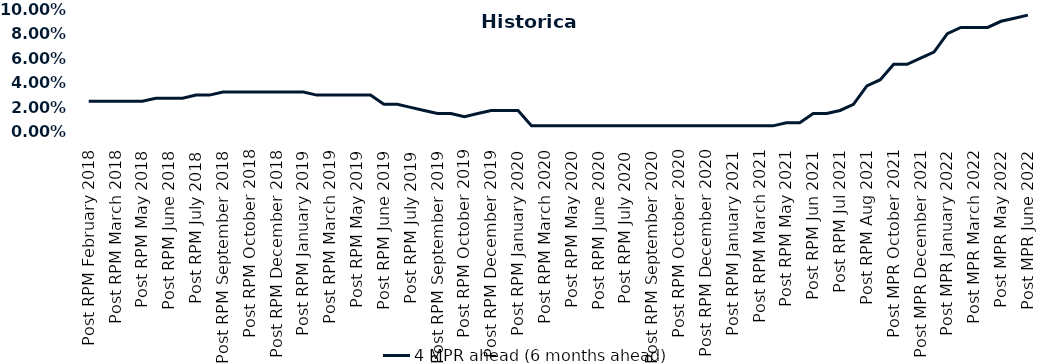
| Category | 4 MPR ahead (6 months ahead) |
|---|---|
| Post RPM February 2018 | 0.025 |
| Pre RPM March 2018 | 0.025 |
| Post RPM March 2018 | 0.025 |
| Pre RPM May 2018 | 0.025 |
| Post RPM May 2018 | 0.025 |
| Pre RPM June 2018 | 0.028 |
| Post RPM June 2018 | 0.028 |
| Pre RPM July 2018 | 0.028 |
| Post RPM July 2018 | 0.03 |
| Pre RPM September 2018 | 0.03 |
| Post RPM September 2018 | 0.032 |
| Pre RPM October 2018 | 0.032 |
| Post RPM October 2018 | 0.032 |
| Pre RPM December 2018 | 0.032 |
| Post RPM December 2018 | 0.032 |
| Pre RPM January 2019 | 0.032 |
| Post RPM January 2019 | 0.032 |
| Pre RPM March 2019 | 0.03 |
| Post RPM March 2019 | 0.03 |
| Pre RPM May 2019 | 0.03 |
| Post RPM May 2019 | 0.03 |
| Pre RPM June 2019 | 0.03 |
| Post RPM June 2019 | 0.022 |
| Pre RPM July 2019 | 0.022 |
| Post RPM July 2019 | 0.02 |
| Pre RPM September 2019 | 0.018 |
| Post RPM September 2019 | 0.015 |
| Pre RPM October 2019 | 0.015 |
| Post RPM October 2019 | 0.012 |
| Pre RPM December 2019 | 0.015 |
| Post RPM December 2019 | 0.018 |
| Pre RPM January 2020 | 0.018 |
| Post RPM January 2020 | 0.018 |
| Pre RPM March 2020 | 0.005 |
| Post RPM March 2020 | 0.005 |
| Pre RPM May 2020 | 0.005 |
| Post RPM May 2020 | 0.005 |
| Pre RPM June 2020 | 0.005 |
| Post RPM June 2020 | 0.005 |
| Pre RPM July 2020 | 0.005 |
| Post RPM July 2020 | 0.005 |
| Pre RPM September 2020 | 0.005 |
| Post RPM September 2020 | 0.005 |
| Pre RPM October 2020 | 0.005 |
| Post RPM October 2020 | 0.005 |
| Pre RPM December 2020 | 0.005 |
|  Post RPM December 2020 | 0.005 |
| Pre RPM January 2021 | 0.005 |
| Post RPM January 2021 | 0.005 |
|  Pre RPM March 2021 | 0.005 |
|  Post RPM March 2021 | 0.005 |
|  Pre RPM May 2021 | 0.005 |
|  Post RPM May 2021 | 0.008 |
|  Pre RPM Jun 2021 | 0.008 |
|   Post RPM Jun 2021 | 0.015 |
| Pre RPM Jul 2021 | 0.015 |
|  Post RPM Jul 2021 | 0.018 |
| Pre RPM Aug 2021 | 0.022 |
|  Post RPM Aug 2021 | 0.038 |
| Pre MPR October 2021 | 0.042 |
| Post MPR October 2021 | 0.055 |
| Pre MPR December 2021 | 0.055 |
| Post MPR December 2021 | 0.06 |
| Pre MPR January 2022 | 0.065 |
| Post MPR January 2022 | 0.08 |
| Pre MPR March 2022 | 0.085 |
| Post MPR March 2022 | 0.085 |
| Pre MPR May 2022 | 0.085 |
| Post MPR May 2022 | 0.09 |
| Pre MPR June 2022 | 0.092 |
| Post MPR June 2022 | 0.095 |